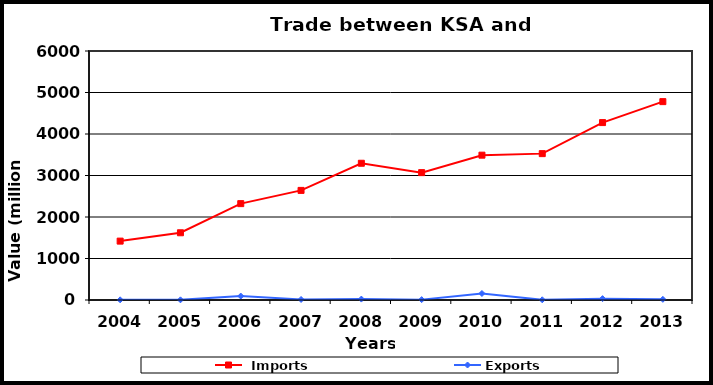
| Category |  Imports | Exports |
|---|---|---|
| 2004.0 | 1419 | 4 |
| 2005.0 | 1620 | 4 |
| 2006.0 | 2322 | 95 |
| 2007.0 | 2641 | 13 |
| 2008.0 | 3295 | 22 |
| 2009.0 | 3069 | 9 |
| 2010.0 | 3490 | 157 |
| 2011.0 | 3527 | 5 |
| 2012.0 | 4275 | 33 |
| 2013.0 | 4780 | 16 |